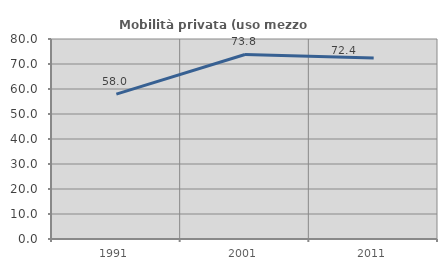
| Category | Mobilità privata (uso mezzo privato) |
|---|---|
| 1991.0 | 57.951 |
| 2001.0 | 73.801 |
| 2011.0 | 72.401 |